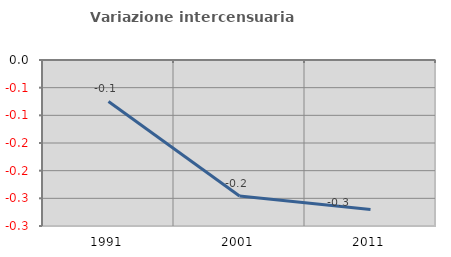
| Category | Variazione intercensuaria annua |
|---|---|
| 1991.0 | -0.075 |
| 2001.0 | -0.246 |
| 2011.0 | -0.27 |